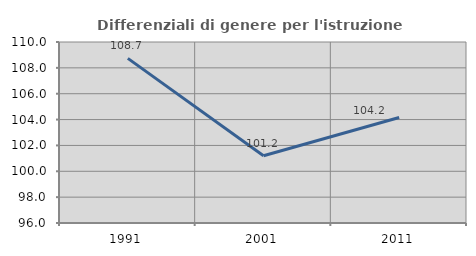
| Category | Differenziali di genere per l'istruzione superiore |
|---|---|
| 1991.0 | 108.736 |
| 2001.0 | 101.205 |
| 2011.0 | 104.159 |